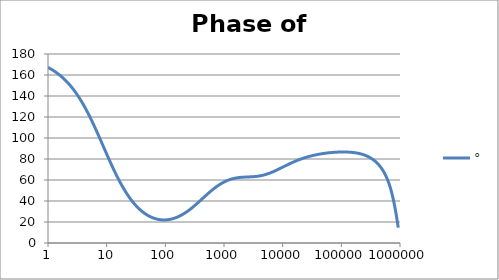
| Category | ° |
|---|---|
| 1.0 | 167.191 |
| 1.0715193052376064 | 166.284 |
| 1.1481536214968828 | 165.315 |
| 1.2302687708123814 | 164.278 |
| 1.318256738556407 | 163.171 |
| 1.4125375446227544 | 161.988 |
| 1.513561248436208 | 160.726 |
| 1.6218100973589298 | 159.378 |
| 1.7378008287493754 | 157.942 |
| 1.8620871366628673 | 156.411 |
| 1.9952623149688797 | 154.781 |
| 2.1379620895022318 | 153.046 |
| 2.2908676527677727 | 151.203 |
| 2.45470891568503 | 149.247 |
| 2.6302679918953817 | 147.172 |
| 2.8183829312644537 | 144.975 |
| 3.0199517204020156 | 142.653 |
| 3.235936569296282 | 140.202 |
| 3.467368504525316 | 137.622 |
| 3.7153522909717256 | 134.909 |
| 3.9810717055349727 | 132.065 |
| 4.265795188015926 | 129.092 |
| 4.570881896148749 | 125.991 |
| 4.897788193684462 | 122.767 |
| 5.2480746024977245 | 119.427 |
| 5.62341325190349 | 115.978 |
| 6.025595860743575 | 112.431 |
| 6.456542290346554 | 108.797 |
| 6.918309709189363 | 105.09 |
| 7.4131024130091765 | 101.324 |
| 7.943282347242814 | 97.515 |
| 8.511380382023765 | 93.682 |
| 9.120108393559095 | 89.841 |
| 9.772372209558105 | 86.011 |
| 10.47128548050899 | 82.21 |
| 11.22018454301963 | 78.455 |
| 12.022644346174127 | 74.763 |
| 12.88249551693134 | 71.151 |
| 13.803842646028851 | 67.631 |
| 14.791083881682074 | 64.217 |
| 15.848931924611136 | 60.919 |
| 16.98243652461744 | 57.747 |
| 18.197008586099834 | 54.707 |
| 19.498445997580447 | 51.806 |
| 20.892961308540382 | 49.048 |
| 22.387211385683386 | 46.434 |
| 23.988329190194897 | 43.967 |
| 25.703957827688622 | 41.646 |
| 27.54228703338165 | 39.471 |
| 29.51209226666385 | 37.439 |
| 31.62277660168379 | 35.548 |
| 33.884415613920254 | 33.796 |
| 36.307805477010106 | 32.18 |
| 38.90451449942804 | 30.696 |
| 41.686938347033525 | 29.34 |
| 44.6683592150963 | 28.109 |
| 47.86300923226381 | 27 |
| 51.28613839913647 | 26.009 |
| 54.95408738576247 | 25.133 |
| 58.88436553555889 | 24.37 |
| 63.09573444801931 | 23.715 |
| 67.60829753919813 | 23.168 |
| 72.44359600749901 | 22.725 |
| 77.62471166286915 | 22.385 |
| 83.17637711026705 | 22.145 |
| 89.12509381337456 | 22.005 |
| 95.49925860214357 | 21.963 |
| 102.32929922807544 | 22.018 |
| 109.64781961431841 | 22.169 |
| 117.48975549395293 | 22.415 |
| 125.89254117941665 | 22.756 |
| 134.89628825916537 | 23.191 |
| 144.54397707459273 | 23.718 |
| 154.88166189124806 | 24.338 |
| 165.95869074375608 | 25.049 |
| 177.82794100389225 | 25.849 |
| 190.5460717963248 | 26.738 |
| 204.17379446695278 | 27.711 |
| 218.77616239495524 | 28.768 |
| 234.42288153199212 | 29.903 |
| 251.18864315095806 | 31.113 |
| 269.15348039269156 | 32.392 |
| 288.4031503126605 | 33.733 |
| 309.0295432513591 | 35.131 |
| 331.1311214825911 | 36.576 |
| 354.81338923357566 | 38.06 |
| 380.18939632056095 | 39.573 |
| 407.3802778041123 | 41.105 |
| 436.5158322401654 | 42.644 |
| 467.7351412871979 | 44.179 |
| 501.18723362727184 | 45.701 |
| 537.0317963702526 | 47.196 |
| 575.4399373371566 | 48.656 |
| 616.5950018614822 | 50.07 |
| 660.6934480075952 | 51.428 |
| 707.9457843841375 | 52.724 |
| 758.5775750291831 | 53.949 |
| 812.8305161640983 | 55.099 |
| 870.9635899560801 | 56.167 |
| 933.2543007969903 | 57.151 |
| 999.9999999999998 | 58.048 |
| 1071.5193052376057 | 58.857 |
| 1148.1536214968828 | 59.579 |
| 1230.2687708123801 | 60.214 |
| 1318.2567385564053 | 60.765 |
| 1412.537544622753 | 61.235 |
| 1513.5612484362066 | 61.629 |
| 1621.8100973589292 | 61.953 |
| 1737.8008287493742 | 62.212 |
| 1862.0871366628671 | 62.416 |
| 1995.2623149688786 | 62.573 |
| 2137.9620895022326 | 62.691 |
| 2290.867652767771 | 62.782 |
| 2454.708915685027 | 62.856 |
| 2630.26799189538 | 62.924 |
| 2818.382931264451 | 62.998 |
| 3019.9517204020176 | 63.088 |
| 3235.9365692962774 | 63.204 |
| 3467.368504525316 | 63.357 |
| 3715.352290971724 | 63.554 |
| 3981.07170553497 | 63.804 |
| 4265.795188015923 | 64.111 |
| 4570.881896148745 | 64.479 |
| 4897.788193684463 | 64.91 |
| 5248.074602497726 | 65.404 |
| 5623.413251903489 | 65.959 |
| 6025.595860743574 | 66.571 |
| 6456.54229034655 | 67.236 |
| 6918.309709189357 | 67.948 |
| 7413.102413009165 | 68.699 |
| 7943.282347242815 | 69.482 |
| 8511.380382023763 | 70.289 |
| 9120.108393559092 | 71.113 |
| 9772.3722095581 | 71.945 |
| 10471.285480509003 | 72.779 |
| 11220.184543019639 | 73.607 |
| 12022.64434617411 | 74.425 |
| 12882.495516931338 | 75.228 |
| 13803.842646028841 | 76.01 |
| 14791.083881682063 | 76.768 |
| 15848.931924611119 | 77.5 |
| 16982.436524617453 | 78.203 |
| 18197.008586099837 | 78.877 |
| 19498.445997580417 | 79.519 |
| 20892.961308540387 | 80.129 |
| 22387.211385683382 | 80.707 |
| 23988.32919019488 | 81.254 |
| 25703.957827688606 | 81.77 |
| 27542.28703338167 | 82.254 |
| 29512.092266663854 | 82.709 |
| 31622.77660168378 | 83.134 |
| 33884.41561392023 | 83.532 |
| 36307.805477010166 | 83.902 |
| 38904.514499428085 | 84.246 |
| 41686.93834703348 | 84.564 |
| 44668.35921509631 | 84.858 |
| 47863.00923226382 | 85.128 |
| 51286.13839913646 | 85.375 |
| 54954.08738576241 | 85.6 |
| 58884.365535558936 | 85.804 |
| 63095.73444801934 | 85.986 |
| 67608.29753919817 | 86.147 |
| 72443.59600749899 | 86.288 |
| 77624.71166286913 | 86.407 |
| 83176.37711026703 | 86.506 |
| 89125.09381337445 | 86.583 |
| 95499.25860214363 | 86.637 |
| 102329.29922807543 | 86.668 |
| 109647.81961431848 | 86.674 |
| 117489.75549395289 | 86.654 |
| 125892.54117941685 | 86.604 |
| 134896.28825916522 | 86.523 |
| 144543.97707459255 | 86.408 |
| 154881.66189124787 | 86.254 |
| 165958.69074375575 | 86.058 |
| 177827.9410038922 | 85.814 |
| 190546.07179632425 | 85.516 |
| 204173.79446695274 | 85.159 |
| 218776.16239495497 | 84.735 |
| 234422.88153199226 | 84.236 |
| 251188.64315095753 | 83.652 |
| 269153.480392691 | 82.974 |
| 288403.15031266044 | 82.19 |
| 309029.5432513582 | 81.287 |
| 331131.1214825907 | 80.25 |
| 354813.3892335749 | 79.06 |
| 380189.3963205612 | 77.697 |
| 407380.2778041119 | 76.135 |
| 436515.8322401649 | 74.34 |
| 467735.14128719777 | 72.272 |
| 501187.2336272717 | 69.877 |
| 537031.7963702519 | 67.088 |
| 575439.9373371559 | 63.814 |
| 616595.001861482 | 59.94 |
| 660693.4480075944 | 55.314 |
| 707945.7843841374 | 49.752 |
| 758577.575029183 | 43.039 |
| 812830.5161640996 | 34.973 |
| 870963.5899560791 | 25.45 |
| 933254.3007969892 | 14.612 |